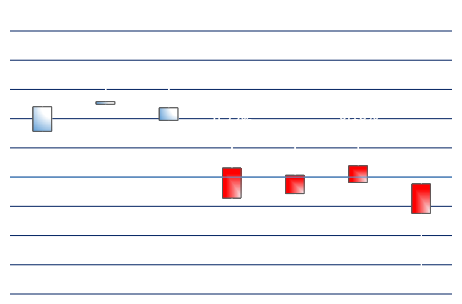
| Category | Series 0 | Series 1 | Series 2 | Series 3 |
|---|---|---|---|---|
| GCEJ7 | 0.016 | 0.028 | 0.014 | 0.024 |
| SIEK7 | 0.025 | 0.039 | 0.022 | 0.026 |
| PLEJ7 | 0.019 | 0.039 | 0.018 | 0.024 |
| CLEJ7 | 0.003 | 0.016 | -0.008 | -0.007 |
| HOEJ7 | 0.001 | 0.012 | -0.006 | -0.006 |
| RBEJ7 | 0.004 | 0.017 | -0.003 | -0.002 |
| NGEJ7 | -0.002 | -0.002 | -0.031 | -0.012 |